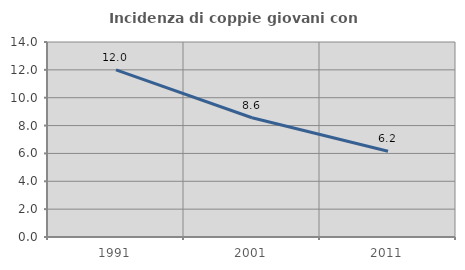
| Category | Incidenza di coppie giovani con figli |
|---|---|
| 1991.0 | 11.996 |
| 2001.0 | 8.561 |
| 2011.0 | 6.154 |